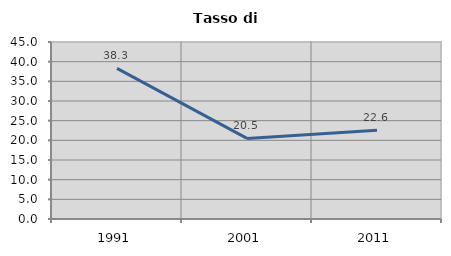
| Category | Tasso di disoccupazione   |
|---|---|
| 1991.0 | 38.288 |
| 2001.0 | 20.489 |
| 2011.0 | 22.581 |